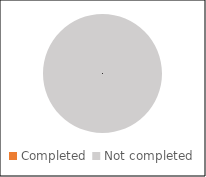
| Category | Financial |
|---|---|
| Completed  | 0 |
| Not completed | 1 |